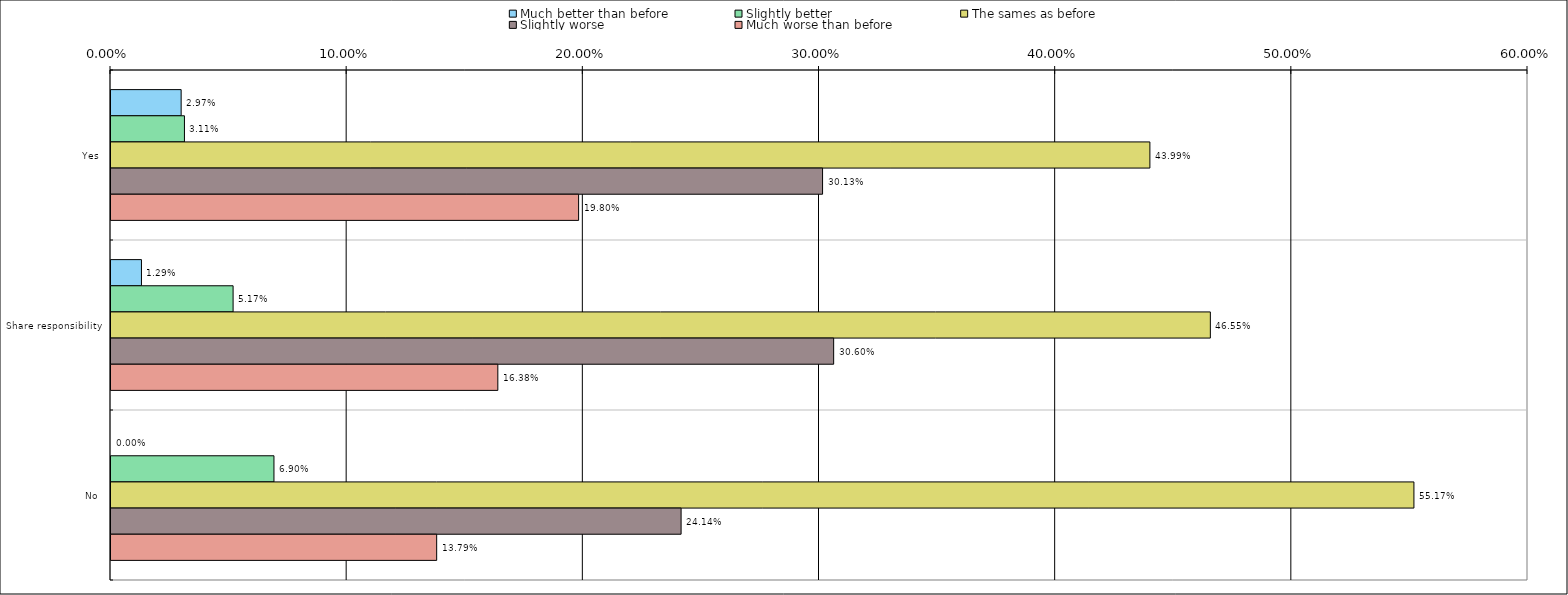
| Category | Much better than before | Slightly better | The sames as before | Slightly worse | Much worse than before |
|---|---|---|---|---|---|
| 0 | 0.03 | 0.031 | 0.44 | 0.301 | 0.198 |
| 1 | 0.013 | 0.052 | 0.466 | 0.306 | 0.164 |
| 2 | 0 | 0.069 | 0.552 | 0.241 | 0.138 |